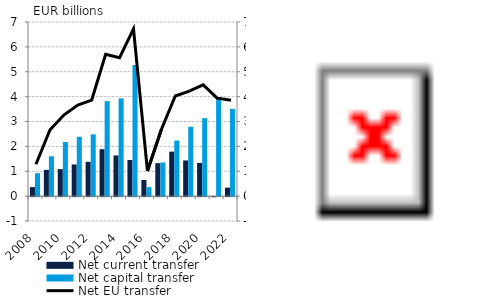
| Category | Net current transfer | Net capital transfer |
|---|---|---|
| 2008.0 | 0.362 | 0.921 |
| 2009.0 | 1.055 | 1.603 |
| 2010.0 | 1.085 | 2.174 |
| 2011.0 | 1.273 | 2.387 |
| 2012.0 | 1.378 | 2.484 |
| 2013.0 | 1.887 | 3.817 |
| 2014.0 | 1.635 | 3.928 |
| 2015.0 | 1.452 | 5.271 |
| 2016.0 | 0.65 | 0.363 |
| 2017.0 | 1.325 | 1.353 |
| 2018.0 | 1.789 | 2.235 |
| 2019.0 | 1.435 | 2.787 |
| 2020.0 | 1.336 | 3.135 |
| 2021.0 | -0.006 | 3.945 |
| 2022.0 | 0.341 | 3.51 |